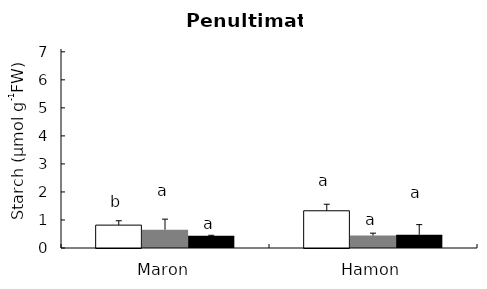
| Category | 14 DAA AVR | non-defoliated AVR | Defoliated AVR |
|---|---|---|---|
| Maron | 0.817 | 0.655 | 0.438 |
| Hamon | 1.328 | 0.444 | 0.473 |